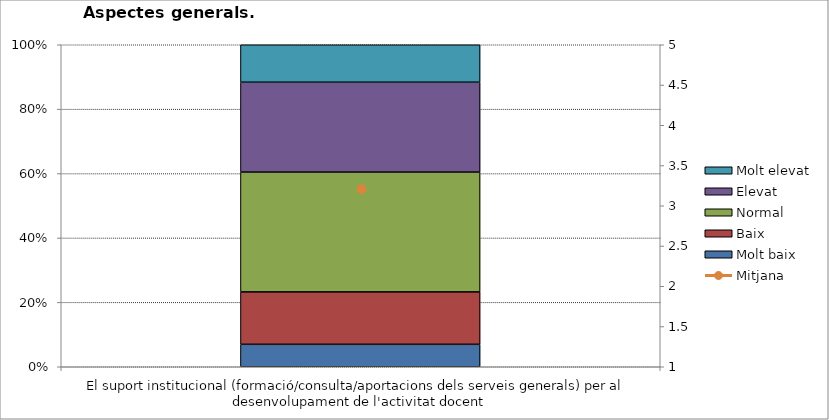
| Category | Molt baix | Baix | Normal  | Elevat | Molt elevat |
|---|---|---|---|---|---|
| El suport institucional (formació/consulta/aportacions dels serveis generals) per al desenvolupament de l'activitat docent | 3 | 7 | 16 | 12 | 5 |